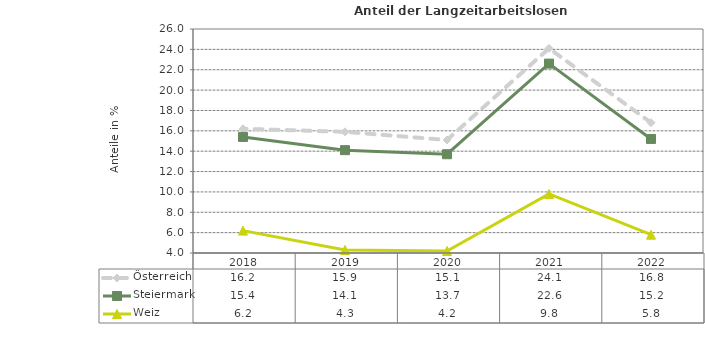
| Category | Österreich | Steiermark | Weiz |
|---|---|---|---|
| 2022.0 | 16.8 | 15.2 | 5.8 |
| 2021.0 | 24.1 | 22.6 | 9.8 |
| 2020.0 | 15.1 | 13.7 | 4.2 |
| 2019.0 | 15.9 | 14.1 | 4.3 |
| 2018.0 | 16.2 | 15.4 | 6.2 |